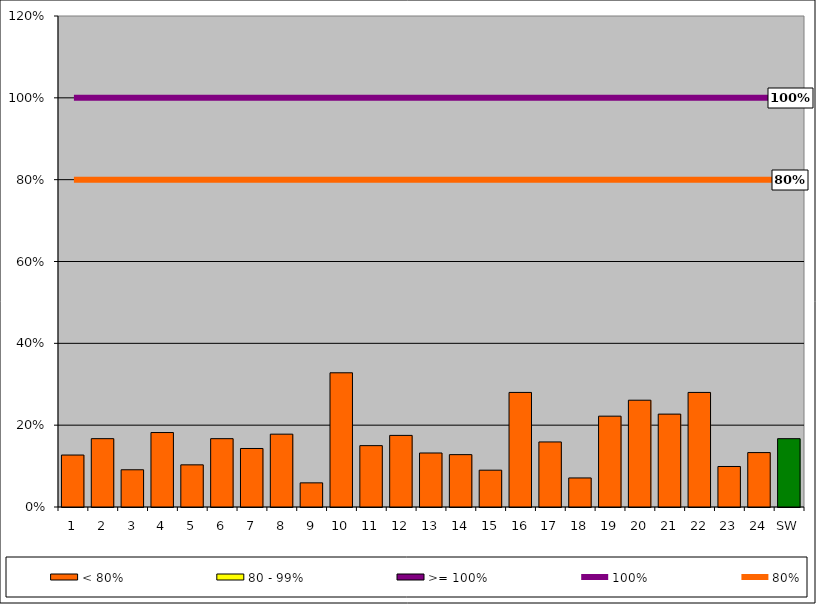
| Category | < 80% | 80 - 99% | >= 100% |
|---|---|---|---|
| 1 | 0.127 | 0 | 0 |
| 2 | 0.167 | 0 | 0 |
| 3 | 0.091 | 0 | 0 |
| 4 | 0.182 | 0 | 0 |
| 5 | 0.103 | 0 | 0 |
| 6 | 0.167 | 0 | 0 |
| 7 | 0.143 | 0 | 0 |
| 8 | 0.178 | 0 | 0 |
| 9 | 0.059 | 0 | 0 |
| 10 | 0.328 | 0 | 0 |
| 11 | 0.15 | 0 | 0 |
| 12 | 0.175 | 0 | 0 |
| 13 | 0.132 | 0 | 0 |
| 14 | 0.128 | 0 | 0 |
| 15 | 0.09 | 0 | 0 |
| 16 | 0.28 | 0 | 0 |
| 17 | 0.159 | 0 | 0 |
| 18 | 0.071 | 0 | 0 |
| 19 | 0.222 | 0 | 0 |
| 20 | 0.261 | 0 | 0 |
| 21 | 0.227 | 0 | 0 |
| 22 | 0.28 | 0 | 0 |
| 23 | 0.099 | 0 | 0 |
| 24 | 0.133 | 0 | 0 |
| SW | 0.167 | 0 | 0 |